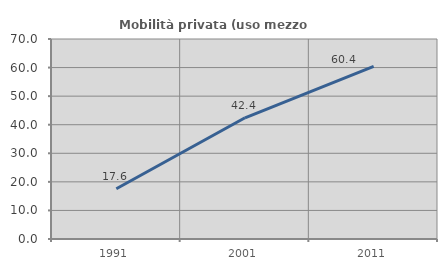
| Category | Mobilità privata (uso mezzo privato) |
|---|---|
| 1991.0 | 17.568 |
| 2001.0 | 42.424 |
| 2011.0 | 60.417 |